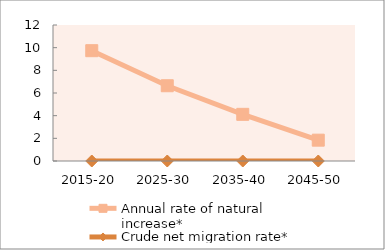
| Category | Annual rate of natural increase* | Crude net migration rate* |
|---|---|---|
| 2015-20 | 9.733 | 0 |
| 2025-30 | 6.641 | 0 |
| 2035-40 | 4.117 | 0 |
| 2045-50 | 1.838 | 0 |